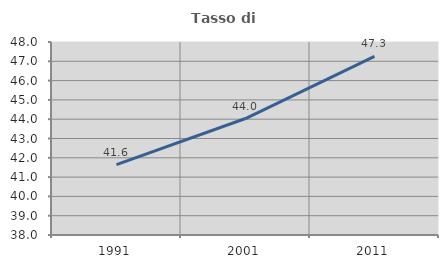
| Category | Tasso di occupazione   |
|---|---|
| 1991.0 | 41.648 |
| 2001.0 | 44.034 |
| 2011.0 | 47.254 |